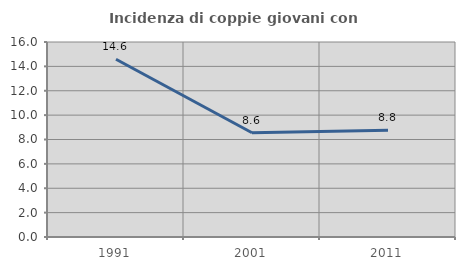
| Category | Incidenza di coppie giovani con figli |
|---|---|
| 1991.0 | 14.583 |
| 2001.0 | 8.557 |
| 2011.0 | 8.764 |